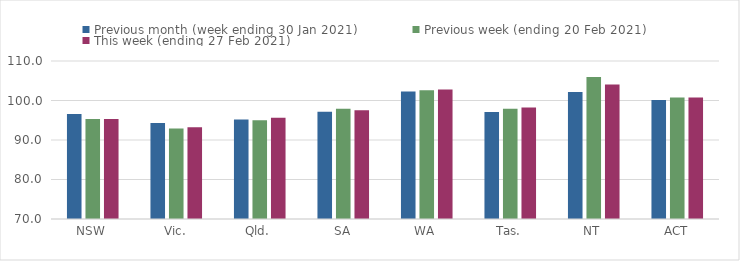
| Category | Previous month (week ending 30 Jan 2021) | Previous week (ending 20 Feb 2021) | This week (ending 27 Feb 2021) |
|---|---|---|---|
| NSW | 96.58 | 95.3 | 95.31 |
| Vic. | 94.29 | 92.88 | 93.23 |
| Qld. | 95.19 | 95 | 95.66 |
| SA | 97.14 | 97.88 | 97.55 |
| WA | 102.25 | 102.59 | 102.76 |
| Tas. | 97.1 | 97.9 | 98.25 |
| NT | 102.18 | 105.95 | 104.02 |
| ACT | 100.11 | 100.79 | 100.73 |